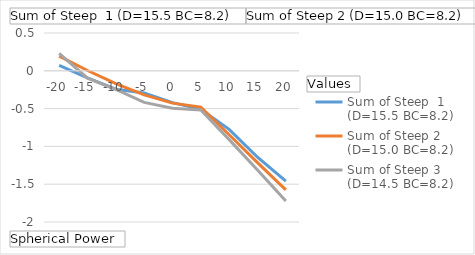
| Category | Sum of Steep  1 (D=15.5 BC=8.2) | Sum of Steep 2 (D=15.0 BC=8.2) | Sum of Steep 3 (D=14.5 BC=8.2) |
|---|---|---|---|
| -20 | 0.071 | 0.195 | 0.232 |
| -15 | -0.093 | 0.004 | -0.097 |
| -10 | -0.243 | -0.171 | -0.247 |
| -5 | -0.292 | -0.318 | -0.417 |
| 0 | -0.422 | -0.428 | -0.494 |
| 5 | -0.51 | -0.481 | -0.519 |
| 10 | -0.774 | -0.846 | -0.911 |
| 15 | -1.143 | -1.214 | -1.311 |
| 20 | -1.459 | -1.575 | -1.723 |